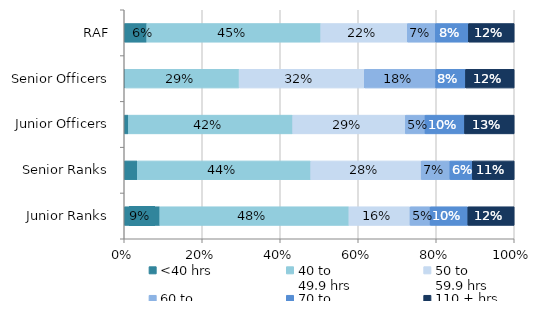
| Category | <40 hrs | 40 to 
49.9 hrs | 50 to 
59.9 hrs | 60 to 
69.9 hrs | 70 to 
109.9 hrs | 110 + hrs |
|---|---|---|---|---|---|---|
| RAF | 0.058 | 0.446 | 0.222 | 0.072 | 0.085 | 0.117 |
| Senior Officers | 0.002 | 0.293 | 0.321 | 0.183 | 0.077 | 0.125 |
| Junior Officers | 0.011 | 0.421 | 0.289 | 0.05 | 0.101 | 0.127 |
| Senior Ranks | 0.034 | 0.445 | 0.283 | 0.074 | 0.058 | 0.107 |
| Junior Ranks | 0.091 | 0.485 | 0.156 | 0.051 | 0.097 | 0.119 |